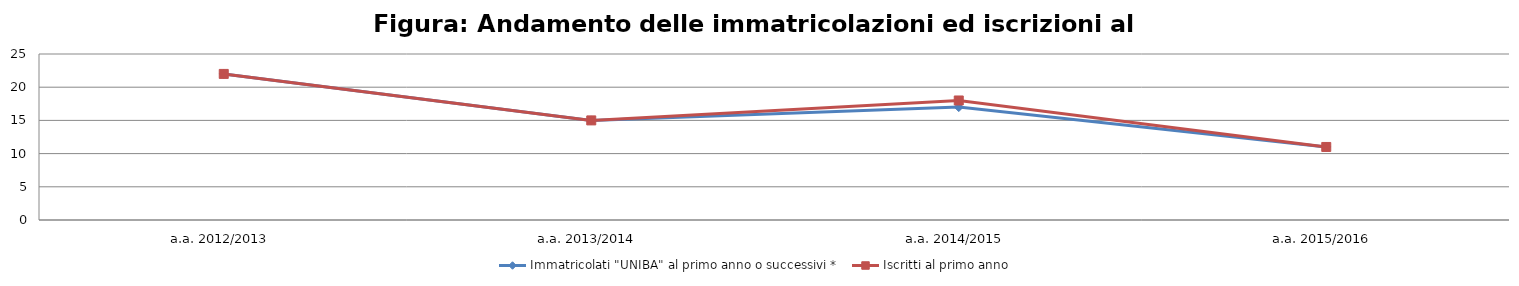
| Category | Immatricolati "UNIBA" al primo anno o successivi * | Iscritti al primo anno  |
|---|---|---|
| a.a. 2012/2013 | 22 | 22 |
| a.a. 2013/2014 | 15 | 15 |
| a.a. 2014/2015 | 17 | 18 |
| a.a. 2015/2016 | 11 | 11 |